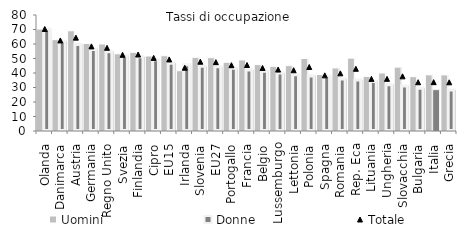
| Category | Uomini | Donne |
|---|---|---|
| Olanda | 70.297 | 70.38 |
| Danimarca | 63.002 | 61.876 |
| Austria | 69.104 | 59.723 |
| Germania | 60.369 | 56.241 |
| Regno Unito | 60.015 | 54.65 |
| Svezia | 53.238 | 51.808 |
| Finlandia | 54.248 | 51.225 |
| Cipro | 51.72 | 49.138 |
| EU15 | 51.913 | 46.723 |
| Irlanda | 41.59 | 45.64 |
| Slovenia | 50.8 | 44.575 |
| EU27 | 50.591 | 44.276 |
| Portogallo | 47.395 | 43.27 |
| Francia | 49.018 | 42.031 |
| Belgio | 45.763 | 41.148 |
| Lussemburgo | 44.632 | 40.043 |
| Lettonia | 45.066 | 38.714 |
| Polonia | 50.033 | 38.009 |
| Spagna | 38.974 | 37.77 |
| Romania | 43.485 | 35.853 |
| Rep. Eca | 50.239 | 35.126 |
| Lituania | 37.63 | 34.122 |
| Ungheria | 40.011 | 31.812 |
| Slovacchia | 44.043 | 31.086 |
| Bulgaria | 37.47 | 29.4 |
| Italia | 38.718 | 28.505 |
| Grecia | 38.668 | 28.288 |